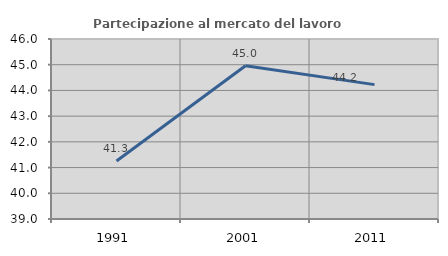
| Category | Partecipazione al mercato del lavoro  femminile |
|---|---|
| 1991.0 | 41.258 |
| 2001.0 | 44.961 |
| 2011.0 | 44.226 |